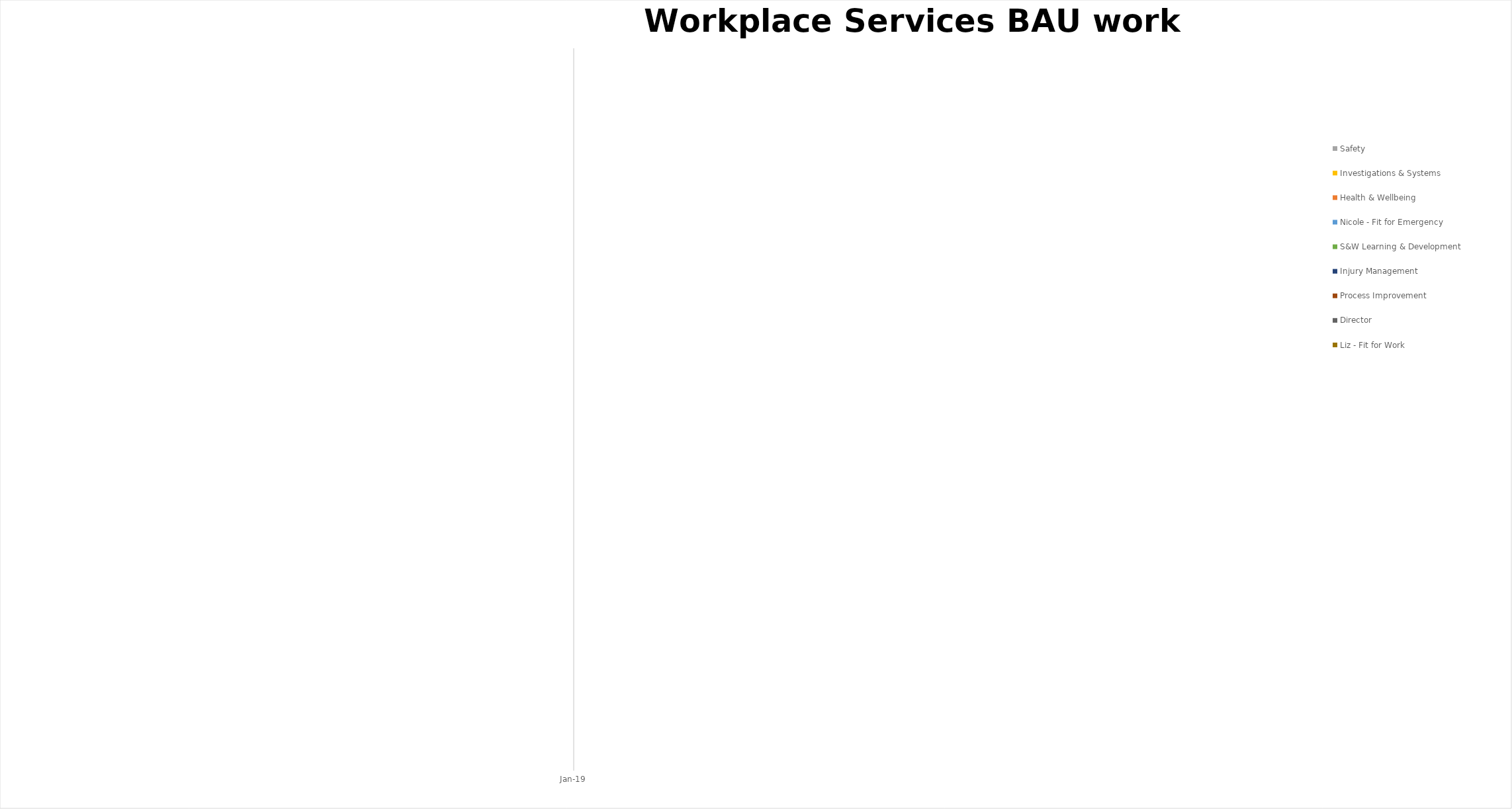
| Category | Start | Safety | Investigations & Systems | Health & Wellbeing | Nicole - Fit for Emergency | S&W Learning & Development | Injury Management | Process Improvement | Director | Liz - Fit for Work |
|---|---|---|---|---|---|---|---|---|---|---|
| 0 | 0 | 0 | 0 | 0 | 0 | 0 | 0 | 0 | 0 | 0 |
| 1 | 0 | 0 | 0 | 0 | 0 | 0 | 0 | 0 | 0 | 0 |
| 2 | 0 | 0 | 0 | 0 | 0 | 0 | 0 | 0 | 0 | 0 |
| 3 | 0 | 0 | 0 | 0 | 0 | 0 | 0 | 0 | 0 | 0 |
| 4 | 0 | 0 | 0 | 0 | 0 | 0 | 0 | 0 | 0 | 0 |
| 5 | 0 | 0 | 0 | 0 | 0 | 0 | 0 | 0 | 0 | 0 |
| 6 | 0 | 0 | 0 | 0 | 0 | 0 | 0 | 0 | 0 | 0 |
| 7 | 0 | 0 | 0 | 0 | 0 | 0 | 0 | 0 | 0 | 0 |
| 8 | 0 | 0 | 0 | 0 | 0 | 0 | 0 | 0 | 0 | 0 |
| 9 | 0 | 0 | 0 | 0 | 0 | 0 | 0 | 0 | 0 | 0 |
| 10 | 0 | 0 | 0 | 0 | 0 | 0 | 0 | 0 | 0 | 0 |
| 11 | 0 | 0 | 0 | 0 | 0 | 0 | 0 | 0 | 0 | 0 |
| 12 | 0 | 0 | 0 | 0 | 0 | 0 | 0 | 0 | 0 | 0 |
| 13 | 0 | 0 | 0 | 0 | 0 | 0 | 0 | 0 | 0 | 0 |
| 14 | 0 | 0 | 0 | 0 | 0 | 0 | 0 | 0 | 0 | 0 |
| 15 | 0 | 0 | 0 | 0 | 0 | 0 | 0 | 0 | 0 | 0 |
| 16 | 0 | 0 | 0 | 0 | 0 | 0 | 0 | 0 | 0 | 0 |
| 17 | 0 | 0 | 0 | 0 | 0 | 0 | 0 | 0 | 0 | 0 |
| 18 | 0 | 0 | 0 | 0 | 0 | 0 | 0 | 0 | 0 | 0 |
| 19 | 0 | 0 | 0 | 0 | 0 | 0 | 0 | 0 | 0 | 0 |
| 20 | 0 | 0 | 0 | 0 | 0 | 0 | 0 | 0 | 0 | 0 |
| 21 | 0 | 0 | 0 | 0 | 0 | 0 | 0 | 0 | 0 | 0 |
| 22 | 0 | 0 | 0 | 0 | 0 | 0 | 0 | 0 | 0 | 0 |
| 23 | 0 | 0 | 0 | 0 | 0 | 0 | 0 | 0 | 0 | 0 |
| 24 | 0 | 0 | 0 | 0 | 0 | 0 | 0 | 0 | 0 | 0 |
| 25 | 0 | 0 | 0 | 0 | 0 | 0 | 0 | 0 | 0 | 0 |
| 26 | 0 | 0 | 0 | 0 | 0 | 0 | 0 | 0 | 0 | 0 |
| 27 | 0 | 0 | 0 | 0 | 0 | 0 | 0 | 0 | 0 | 0 |
| 28 | 0 | 0 | 0 | 0 | 0 | 0 | 0 | 0 | 0 | 0 |
| 29 | 0 | 0 | 0 | 0 | 0 | 0 | 0 | 0 | 0 | 0 |
| 30 | 0 | 0 | 0 | 0 | 0 | 0 | 0 | 0 | 0 | 0 |
| 31 | 0 | 0 | 0 | 0 | 0 | 0 | 0 | 0 | 0 | 0 |
| 32 | 0 | 0 | 0 | 0 | 0 | 0 | 0 | 0 | 0 | 0 |
| 33 | 0 | 0 | 0 | 0 | 0 | 0 | 0 | 0 | 0 | 0 |
| 34 | 0 | 0 | 0 | 0 | 0 | 0 | 0 | 0 | 0 | 0 |